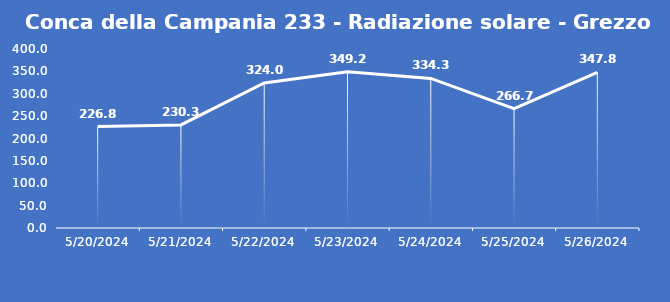
| Category | Conca della Campania 233 - Radiazione solare - Grezzo (W/m2) |
|---|---|
| 5/20/24 | 226.8 |
| 5/21/24 | 230.3 |
| 5/22/24 | 324 |
| 5/23/24 | 349.2 |
| 5/24/24 | 334.3 |
| 5/25/24 | 266.7 |
| 5/26/24 | 347.8 |